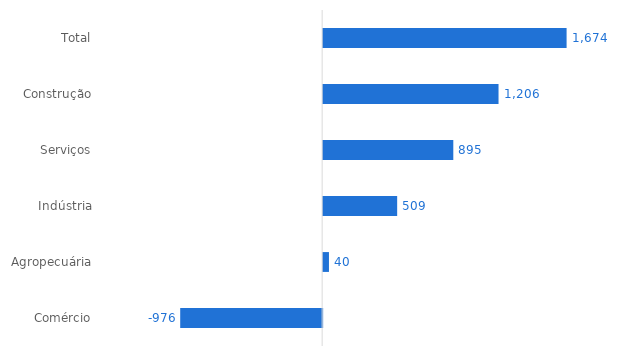
| Category | Espírito Santo |
|---|---|
| Total | 1674 |
| Construção | 1206 |
| Serviços | 895 |
| Indústria | 509 |
| Agropecuária | 40 |
| Comércio | -976 |